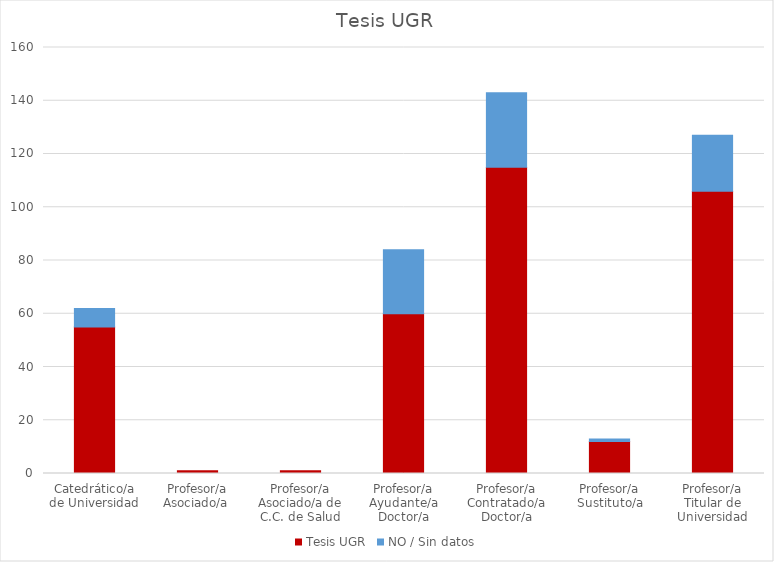
| Category | Tesis UGR | NO / Sin datos |
|---|---|---|
| Catedrático/a de Universidad | 55 | 7 |
| Profesor/a Asociado/a  | 1 | 0 |
| Profesor/a Asociado/a de C.C. de Salud | 1 | 0 |
| Profesor/a Ayudante/a Doctor/a | 60 | 24 |
| Profesor/a Contratado/a Doctor/a | 115 | 28 |
| Profesor/a Sustituto/a | 12 | 1 |
| Profesor/a Titular de Universidad | 106 | 21 |